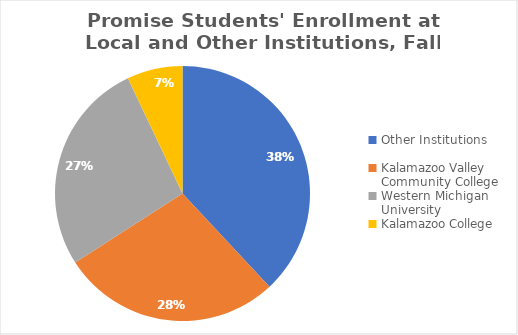
| Category | Series 0 |
|---|---|
| Other Institutions | 0.38 |
| Kalamazoo Valley Community College | 0.279 |
| Western Michigan University | 0.271 |
| Kalamazoo College | 0.07 |